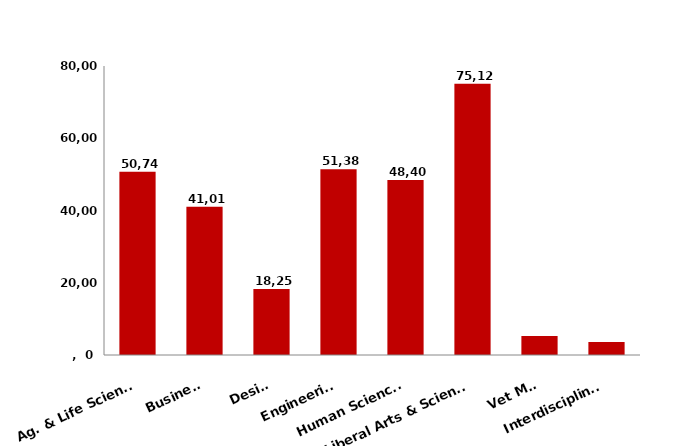
| Category | Series 0 |
|---|---|
| Ag. & Life Sciences | 50749 |
| Business | 41012 |
| Design | 18253 |
| Engineering | 51386 |
| Human Sciences | 48409 |
| Liberal Arts & Sciences | 75121 |
| Vet Med | 5258 |
| Interdisciplinary | 3614 |